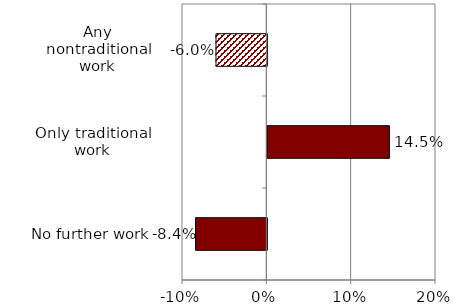
| Category | Series 0 |
|---|---|
| No further work | -0.084 |
| Only traditional work | 0.145 |
| Any nontraditional work | -0.06 |